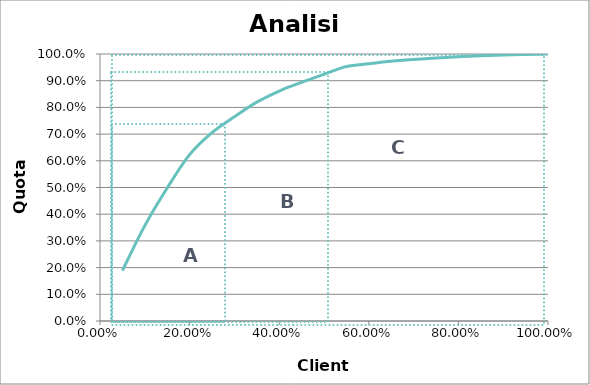
| Category | 18,9% |
|---|---|
| 0.05 | 0.189 |
| 0.1 | 0.357 |
| 0.15000000000000002 | 0.498 |
| 0.2 | 0.623 |
| 0.25 | 0.706 |
| 0.3 | 0.765 |
| 0.35 | 0.82 |
| 0.39999999999999997 | 0.861 |
| 0.44999999999999996 | 0.894 |
| 0.49999999999999994 | 0.924 |
| 0.5499999999999999 | 0.953 |
| 0.6 | 0.963 |
| 0.65 | 0.973 |
| 0.7000000000000001 | 0.979 |
| 0.7500000000000001 | 0.985 |
| 0.8000000000000002 | 0.989 |
| 0.8500000000000002 | 0.993 |
| 0.9000000000000002 | 0.996 |
| 0.9500000000000003 | 0.998 |
| 1.0000000000000002 | 1 |